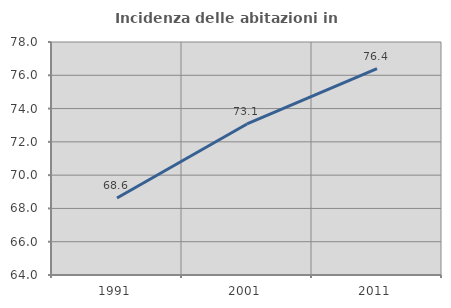
| Category | Incidenza delle abitazioni in proprietà  |
|---|---|
| 1991.0 | 68.627 |
| 2001.0 | 73.077 |
| 2011.0 | 76.395 |